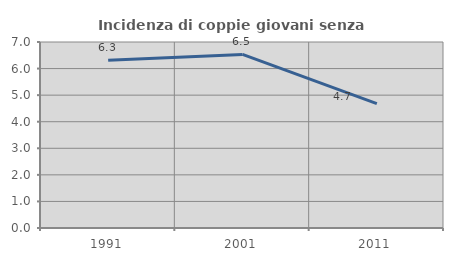
| Category | Incidenza di coppie giovani senza figli |
|---|---|
| 1991.0 | 6.309 |
| 2001.0 | 6.533 |
| 2011.0 | 4.684 |